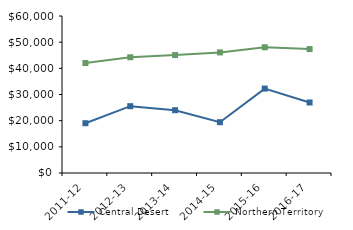
| Category | Central Desert | Northern Territory |
|---|---|---|
| 2011-12 | 19029.9 | 42021 |
| 2012-13 | 25538.62 | 44232.02 |
| 2013-14 | 23996.45 | 45075.51 |
| 2014-15 | 19419.52 | 46083.65 |
| 2015-16 | 32255 | 48046.27 |
| 2016-17 | 26949.76 | 47367.05 |